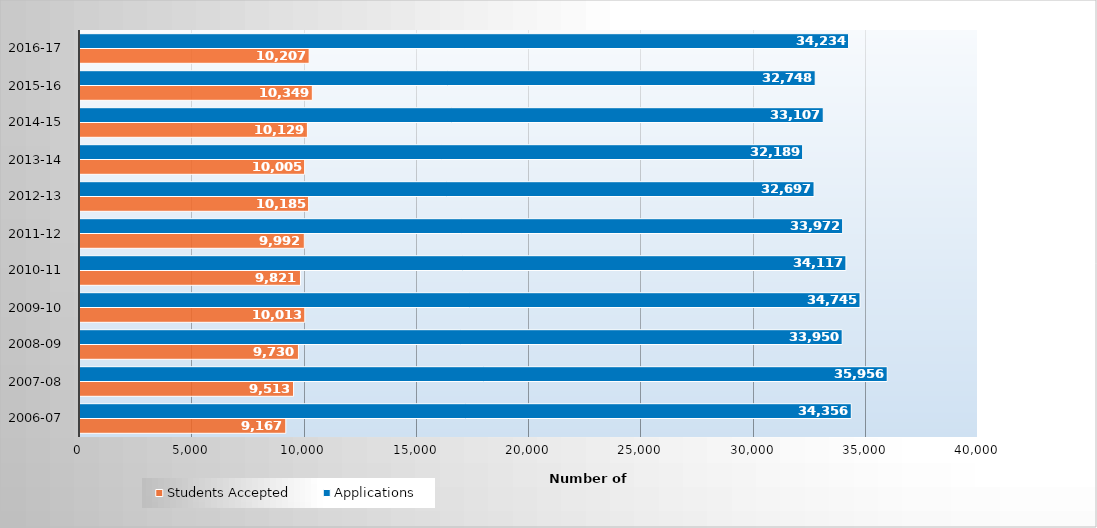
| Category | Students Accepted | Applications |
|---|---|---|
| 2006-07 | 9167 | 34356 |
| 2007-08 | 9513 | 35956 |
| 2008-09 | 9730 | 33950 |
| 2009-10 | 10013 | 34745 |
| 2010-11 | 9821 | 34117 |
| 2011-12 | 9992 | 33972 |
| 2012-13 | 10185 | 32697 |
| 2013-14 | 10005 | 32189 |
| 2014-15 | 10129 | 33107 |
| 2015-16 | 10349 | 32748 |
| 2016-17 | 10207 | 34234 |